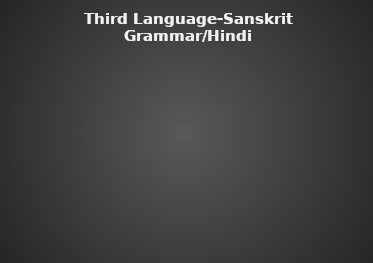
| Category | Third Language-Sanskrit Grammar/Hindi Grammar(Optional) |
|---|---|
| % of Students passed | 0 |
| % of Students need improvement | 0 |